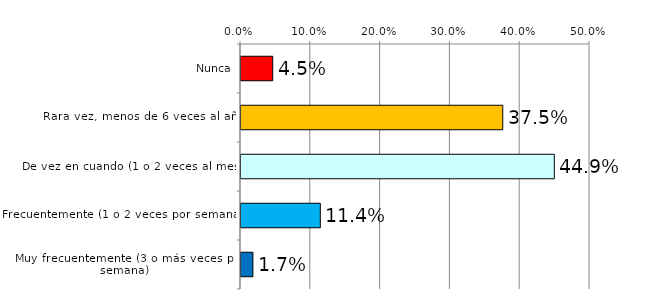
| Category | Series 1 |
|---|---|
| Nunca | 0.045 |
| Rara vez, menos de 6 veces al año | 0.375 |
| De vez en cuando (1 o 2 veces al mes) | 0.449 |
| Frecuentemente (1 o 2 veces por semana) | 0.114 |
| Muy frecuentemente (3 o más veces por semana) | 0.017 |